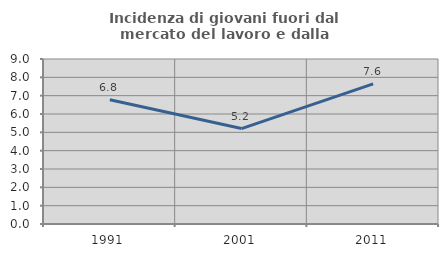
| Category | Incidenza di giovani fuori dal mercato del lavoro e dalla formazione  |
|---|---|
| 1991.0 | 6.774 |
| 2001.0 | 5.205 |
| 2011.0 | 7.646 |